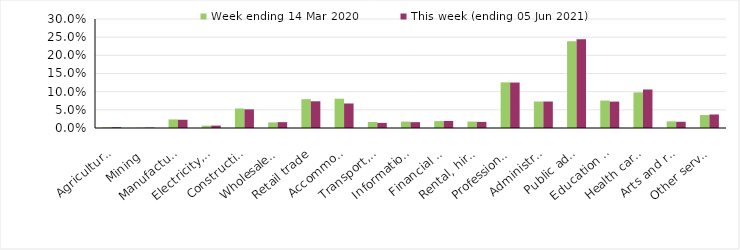
| Category | Week ending 14 Mar 2020 | This week (ending 05 Jun 2021) |
|---|---|---|
| Agriculture, forestry and fishing | 0.002 | 0.002 |
| Mining | 0.001 | 0.001 |
| Manufacturing | 0.024 | 0.023 |
| Electricity, gas, water and waste services | 0.006 | 0.007 |
| Construction | 0.054 | 0.051 |
| Wholesale trade | 0.015 | 0.016 |
| Retail trade | 0.079 | 0.074 |
| Accommodation and food services | 0.081 | 0.068 |
| Transport, postal and warehousing | 0.016 | 0.014 |
| Information media and telecommunications | 0.018 | 0.016 |
| Financial and insurance services | 0.019 | 0.019 |
| Rental, hiring and real estate services | 0.018 | 0.017 |
| Professional, scientific and technical services | 0.126 | 0.125 |
| Administrative and support services | 0.073 | 0.073 |
| Public administration and safety | 0.238 | 0.245 |
| Education and training | 0.076 | 0.073 |
| Health care and social assistance | 0.098 | 0.106 |
| Arts and recreation services | 0.018 | 0.017 |
| Other services | 0.036 | 0.037 |